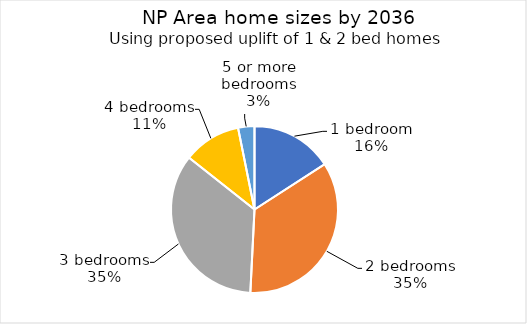
| Category | Series 0 |
|---|---|
| 1 bedroom | 0.159 |
| 2 bedrooms | 0.349 |
| 3 bedrooms | 0.349 |
| 4 bedrooms | 0.112 |
| 5 or more bedrooms | 0.032 |